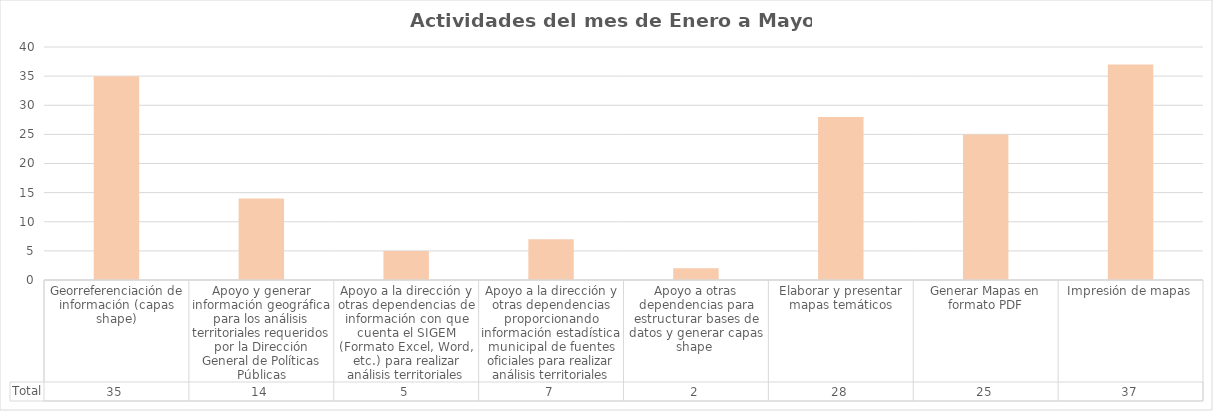
| Category | Total |
|---|---|
| Georreferenciación de información (capas shape) | 35 |
| Apoyo y generar información geográfica para los análisis territoriales requeridos por la Dirección General de Políticas Públicas | 14 |
| Apoyo a la dirección y otras dependencias de información con que cuenta el SIGEM (Formato Excel, Word, etc.) para realizar análisis territoriales | 5 |
| Apoyo a la dirección y otras dependencias proporcionando información estadística municipal de fuentes oficiales para realizar análisis territoriales | 7 |
| Apoyo a otras dependencias para estructurar bases de datos y generar capas shape  | 2 |
| Elaborar y presentar mapas temáticos | 28 |
| Generar Mapas en formato PDF | 25 |
| Impresión de mapas | 37 |